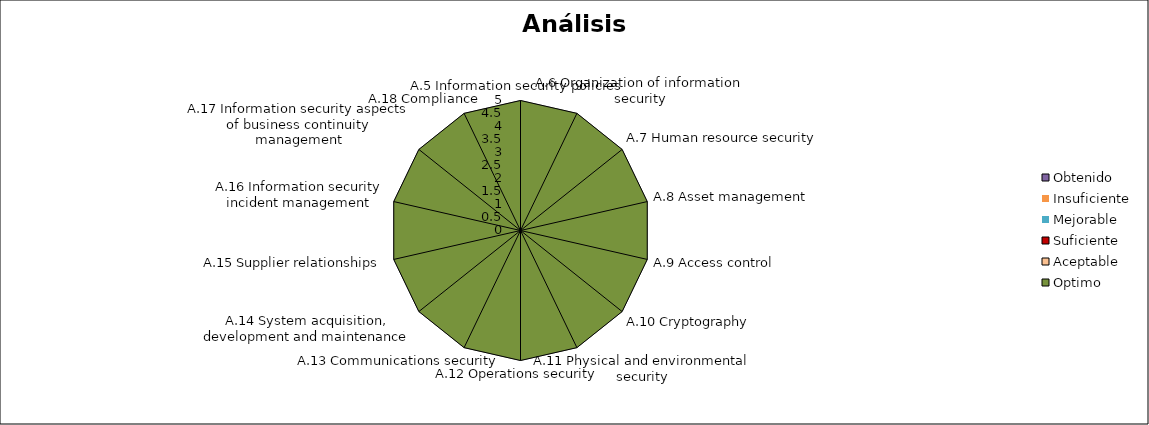
| Category | Obtenido | Insuficiente | Mejorable | Suficiente | Aceptable | Optimo |
|---|---|---|---|---|---|---|
| A.5 Information security policies | 1.5 | 1 | 2 | 3 | 4 | 5 |
| A.6 Organization of information security | 1 | 1 | 2 | 3 | 4 | 5 |
| A.7 Human resource security | 1.889 | 1 | 2 | 3 | 4 | 5 |
| A.8 Asset management | 1 | 1 | 2 | 3 | 4 | 5 |
| A.9 Access control | 2.25 | 1 | 2 | 3 | 4 | 5 |
| A.10 Cryptography | 1 | 1 | 2 | 3 | 4 | 5 |
| A.11 Physical and environmental security | 1.694 | 1 | 2 | 3 | 4 | 5 |
| A.12 Operations security | 1.929 | 1 | 2 | 3 | 4 | 5 |
| A.13 Communications security | 2.292 | 1 | 2 | 3 | 4 | 5 |
| A.14 System acquisition, development and maintenance | 2.014 | 1 | 2 | 3 | 4 | 5 |
| A.15 Supplier relationships | 2.833 | 1 | 2 | 3 | 4 | 5 |
| A.16 Information security incident management | 1.286 | 1 | 2 | 3 | 4 | 5 |
| A.17 Information security aspects of business continuity management | 2.333 | 1 | 2 | 3 | 4 | 5 |
| A.18 Compliance | 0.867 | 1 | 2 | 3 | 4 | 5 |